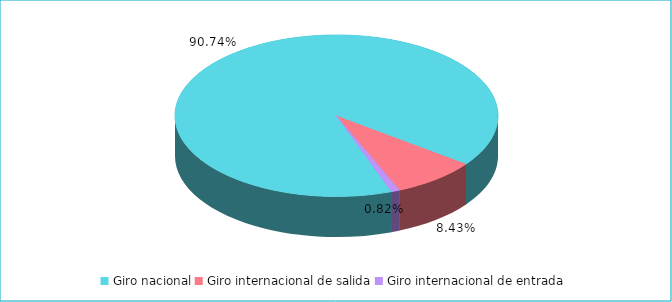
| Category | Series 0 |
|---|---|
| Giro nacional | 0.907 |
| Giro internacional de salida | 0.084 |
| Giro internacional de entrada | 0.008 |